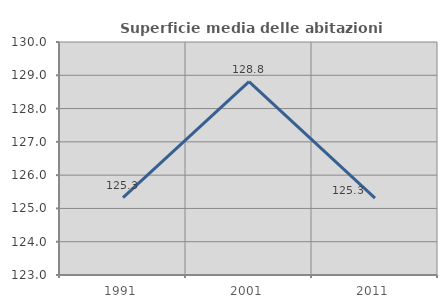
| Category | Superficie media delle abitazioni occupate |
|---|---|
| 1991.0 | 125.327 |
| 2001.0 | 128.808 |
| 2011.0 | 125.31 |